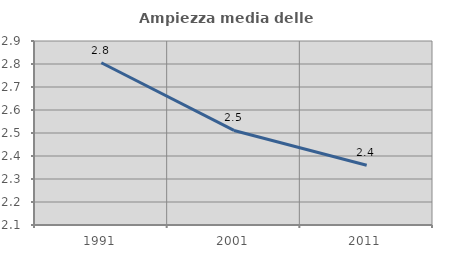
| Category | Ampiezza media delle famiglie |
|---|---|
| 1991.0 | 2.805 |
| 2001.0 | 2.511 |
| 2011.0 | 2.36 |